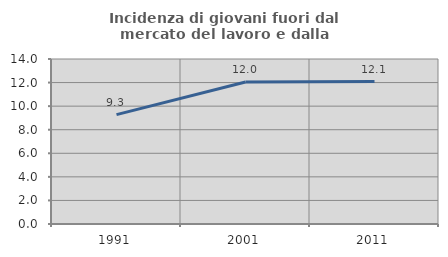
| Category | Incidenza di giovani fuori dal mercato del lavoro e dalla formazione  |
|---|---|
| 1991.0 | 9.283 |
| 2001.0 | 12.048 |
| 2011.0 | 12.088 |